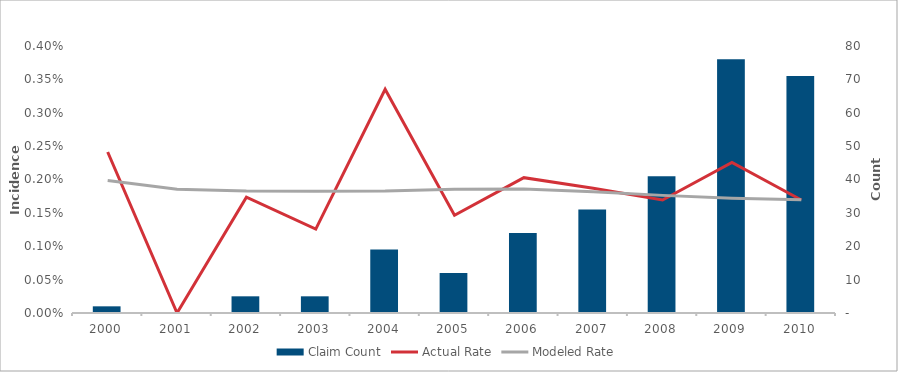
| Category | Claim Count |
|---|---|
| 2000.0 | 2 |
| 2001.0 | 0 |
| 2002.0 | 5 |
| 2003.0 | 5 |
| 2004.0 | 19 |
| 2005.0 | 12 |
| 2006.0 | 24 |
| 2007.0 | 31 |
| 2008.0 | 41 |
| 2009.0 | 76 |
| 2010.0 | 71 |